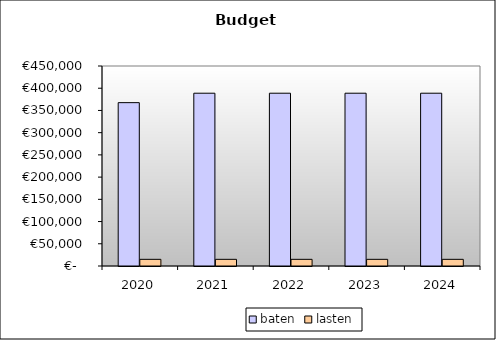
| Category | baten | lasten |
|---|---|---|
| 2020.0 | 367543.25 | 15000 |
| 2021.0 | 388771.69 | 15000 |
| 2022.0 | 388771.69 | 15000 |
| 2023.0 | 388771.69 | 15000 |
| 2024.0 | 388771.69 | 15000 |